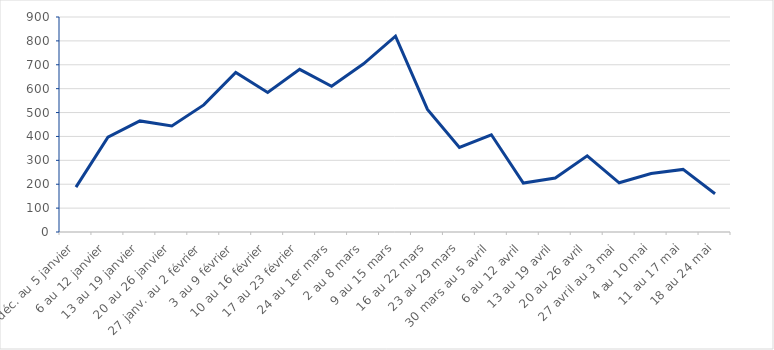
| Category | Series 0 |
|---|---|
| 30 déc. au 5 janvier | 188 |
| 6 au 12 janvier | 397 |
| 13 au 19 janvier | 465 |
| 20 au 26 janvier | 444 |
| 27 janv. au 2 février | 532 |
| 3 au 9 février | 668 |
| 10 au 16 février | 584 |
| 17 au 23 février | 681 |
| 24 au 1er mars | 610 |
| 2 au 8 mars | 704 |
| 9 au 15 mars | 820 |
| 16 au 22 mars | 513 |
| 23 au 29 mars | 354 |
| 30 mars au 5 avril | 407 |
| 6 au 12 avril | 205 |
| 13 au 19 avril | 226 |
| 20 au 26 avril | 319 |
| 27 avril au 3 mai | 206 |
| 4 au 10 mai | 245 |
| 11 au 17 mai | 262 |
| 18 au 24 mai | 160 |